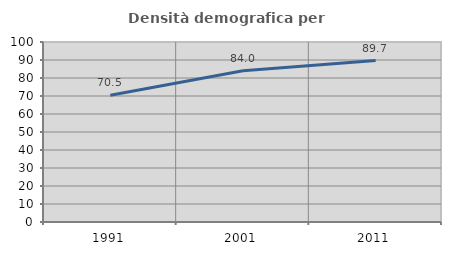
| Category | Densità demografica |
|---|---|
| 1991.0 | 70.471 |
| 2001.0 | 84.023 |
| 2011.0 | 89.685 |